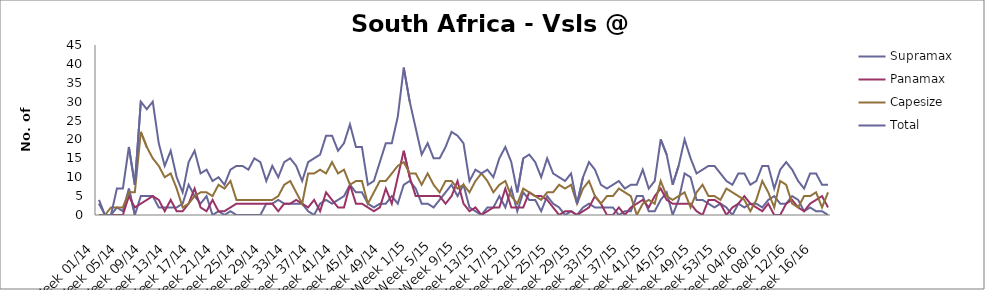
| Category | Supramax | Panamax | Capesize | Total |
|---|---|---|---|---|
| Week 01/14 | 3 | 0 | 0 | 4 |
| Week 02/14 | 0 | 0 | 0 | 0 |
| Week 03/14 | 0 | 0 | 2 | 0 |
| Week 04/14 | 2 | 0 | 2 | 7 |
| Week 05/14 | 1 | 0 | 2 | 7 |
| Week 06/14 | 7 | 5 | 6 | 18 |
| Week 07/14 | 0 | 2 | 6 | 8 |
| Week 08/14 | 5 | 3 | 22 | 30 |
| Week 09/14 | 5 | 4 | 18 | 28 |
| Week 10/14 | 5 | 5 | 15 | 30 |
| Week 11/14 | 2 | 4 | 13 | 19 |
| Week 12/14 | 2 | 1 | 10 | 13 |
| Week 13/14 | 2 | 4 | 11 | 17 |
| Week 14/14 | 2 | 1 | 7 | 10 |
| Week 15/14 | 3 | 1 | 2 | 6 |
| Week 16/14 | 8 | 3 | 3 | 14 |
| Week 17/14 | 5 | 7 | 5 | 17 |
| Week 18/14 | 3 | 2 | 6 | 11 |
| Week 19/14 | 5 | 1 | 6 | 12 |
| Week 20/14 | 0 | 4 | 5 | 9 |
| Week 21/14 | 1 | 1 | 8 | 10 |
| Week 22/14 | 0 | 1 | 7 | 8 |
| Week 23/14 | 1 | 2 | 9 | 12 |
| Week 24/14 | 0 | 3 | 4 | 13 |
| Week 25/14 | 0 | 3 | 4 | 13 |
| Week 26/14 | 0 | 3 | 4 | 12 |
| Week 27/14 | 0 | 3 | 4 | 15 |
| Week 28/14 | 0 | 3 | 4 | 14 |
| Week 29/14 | 3 | 3 | 4 | 9 |
| Week 30/14 | 3 | 3 | 4 | 13 |
| Week 31/14 | 4 | 1 | 5 | 10 |
| Week 32/14 | 3 | 3 | 8 | 14 |
| Week 33/14 | 3 | 3 | 9 | 15 |
| Week 34/14 | 3 | 4 | 6 | 13 |
| Week 35/14 | 3 | 3 | 3 | 9 |
| Week 36/14 | 1 | 2 | 11 | 14 |
| Week 37/14 | 0 | 4 | 11 | 15 |
| Week 38/14 | 3 | 1 | 12 | 16 |
| Week 39/14 | 4 | 6 | 11 | 21 |
| Week 40/14 | 3 | 4 | 14 | 21 |
| Week 41/14 | 4 | 2 | 11 | 17 |
| Week 42/14 | 5 | 2 | 12 | 19 |
| Week 43/14 | 8 | 8 | 8 | 24 |
| Week 44/14 | 6 | 3 | 9 | 18 |
| Week 45/14 | 6 | 3 | 9 | 18 |
| Week 46/14 | 3 | 2 | 3 | 8 |
| Week 47/14 | 2 | 1 | 6 | 9 |
| Week 48/14 | 3 | 2 | 9 | 14 |
| Week 49/14 | 3 | 7 | 9 | 19 |
| Week 50/14 | 5 | 3 | 11 | 19 |
| Week 51/14 | 3 | 10 | 13 | 26 |
| Week 52/14 | 8 | 17 | 14 | 39 |
| Week 1/15 | 9 | 10 | 11 | 30 |
| Week 2/15 | 7 | 5 | 11 | 23 |
| Week 3/15 | 3 | 5 | 8 | 16 |
| Week 4/15 | 3 | 5 | 11 | 19 |
| Week 5/15 | 2 | 5 | 8 | 15 |
| Week 6/15 | 4 | 5 | 6 | 15 |
| Week 7/15 | 6 | 3 | 9 | 18 |
| Week 8/15 | 8 | 5 | 9 | 22 |
| Week 9/15 | 5 | 9 | 7 | 21 |
| Week 10/15 | 8 | 3 | 8 | 19 |
| Week 11/15 | 2 | 1 | 6 | 9 |
| Week 12/15 | 1 | 2 | 9 | 12 |
| Week 13/15 | 0 | 0 | 11 | 11 |
| Week 14/15 | 2 | 1 | 9 | 12 |
| Week 15/15 | 2 | 2 | 6 | 10 |
| Week 16/15 | 5 | 2 | 8 | 15 |
| Week 17/15 | 2 | 7 | 9 | 18 |
| Week 18/15 | 7 | 2 | 5 | 14 |
| Week 19/15 | 1 | 2 | 3 | 6 |
| Week 20/15 | 6 | 2 | 7 | 15 |
| Week 21/15 | 4 | 6 | 6 | 16 |
| Week 22/15 | 4 | 5 | 5 | 14 |
| Week 23/15 | 1 | 5 | 4 | 10 |
| Week 24/15 | 5 | 4 | 6 | 15 |
| Week 25/15 | 3 | 2 | 6 | 11 |
| Week 26/15 | 2 | 0 | 8 | 10 |
| Week 27/15 | 0 | 1 | 7 | 9 |
| Week 28/15 | 1 | 1 | 8 | 11 |
| Week 29/15 | 0 | 0 | 3 | 3 |
| Week 30/15 | 2 | 1 | 7 | 10 |
| Week 31/15 | 3 | 2 | 9 | 14 |
| Week 32/15 | 2 | 5 | 5 | 12 |
| Week 33/15 | 2 | 3 | 3 | 8 |
| Week 34/15 | 2 | 0 | 5 | 7 |
| Week 35/15 | 2 | 0 | 5 | 8 |
| Week 36/15 | 0 | 2 | 7 | 9 |
| Week 37/15 | 1 | 0 | 6 | 7 |
| Week 38/15 | 1 | 2 | 5 | 8 |
| Week 39/15 | 5 | 3 | 0 | 8 |
| Week 40/15 | 5 | 4 | 3 | 12 |
| Week 41/15 | 1 | 2 | 4 | 7 |
| Week 42/15 | 1 | 5 | 3 | 9 |
| Week 43/15 | 4 | 7 | 9 | 20 |
| Week 44/15 | 6 | 4 | 5 | 16 |
| Week 45/15 | 0 | 3 | 4 | 8 |
| Week 46/15 | 4 | 3 | 5 | 13 |
| Week 47/15 | 11 | 3 | 6 | 20 |
| Week 48/15 | 10 | 3 | 2 | 15 |
| Week 49/15 | 4 | 1 | 6 | 11 |
| Week 50/15 | 4 | 0 | 8 | 12 |
| Week 51/15 | 3 | 4 | 5 | 13 |
| Week 52/15 | 2 | 4 | 5 | 13 |
| Week 53/15 | 3 | 3 | 4 | 11 |
| Week 01/16 | 2 | 0 | 7 | 9 |
| Week 02/16 | 0 | 2 | 6 | 8 |
| Week 03/16 | 3 | 3 | 5 | 11 |
| Week 04/16 | 2 | 5 | 4 | 11 |
| Week 05/16 | 3 | 3 | 1 | 8 |
| Week 06/16 | 3 | 2 | 4 | 9 |
| Week 07/16 | 2 | 1 | 9 | 13 |
| Week 08/16 | 4 | 3 | 6 | 13 |
| Week 09/16 | 5 | 0 | 2 | 7 |
| Week 10/16 | 3 | 0 | 9 | 12 |
| Week 11/16 | 3 | 3 | 8 | 14 |
| Week 12/16 | 5 | 4 | 3 | 12 |
| Week 13/16 | 4 | 2 | 2 | 9 |
| Week 14/16 | 1 | 1 | 5 | 7 |
| Week 15/16 | 2 | 3 | 5 | 11 |
| Week 16/16 | 1 | 4 | 6 | 11 |
| Week 17/16 | 1 | 5 | 2 | 8 |
| Week 18/16 | 0 | 2 | 6 | 8 |